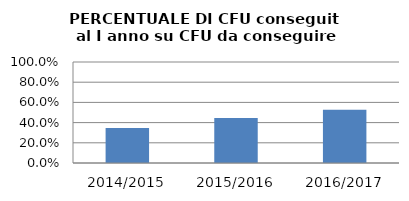
| Category | 2014/2015 2015/2016 2016/2017 |
|---|---|
| 2014/2015 | 0.347 |
| 2015/2016 | 0.446 |
| 2016/2017 | 0.526 |